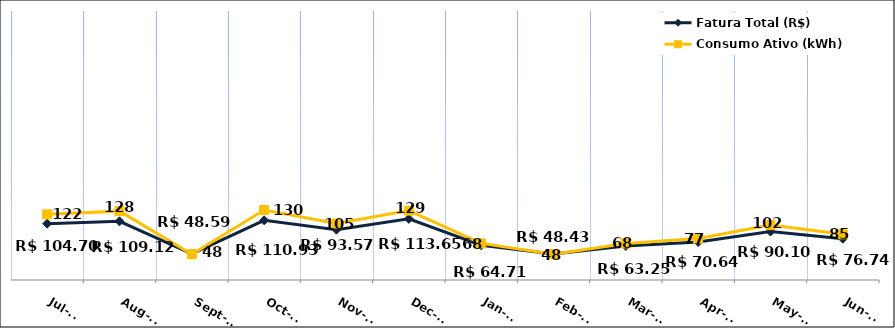
| Category | Fatura Total (R$) |
|---|---|
| 2023-07-01 | 104.7 |
| 2023-08-01 | 109.12 |
| 2023-09-01 | 48.59 |
| 2023-10-01 | 110.93 |
| 2023-11-01 | 93.57 |
| 2023-12-01 | 113.65 |
| 2024-01-01 | 64.71 |
| 2024-02-01 | 48.43 |
| 2024-03-01 | 63.25 |
| 2024-04-01 | 70.64 |
| 2024-05-01 | 90.1 |
| 2024-06-01 | 76.74 |